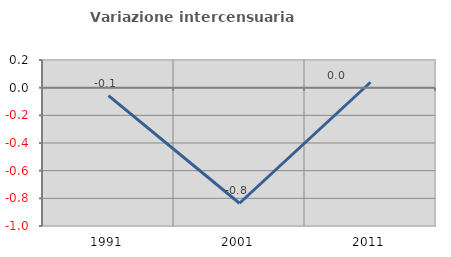
| Category | Variazione intercensuaria annua |
|---|---|
| 1991.0 | -0.058 |
| 2001.0 | -0.836 |
| 2011.0 | 0.039 |